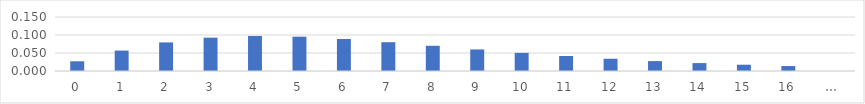
| Category | Series 0 |
|---|---|
| 0 | 0.027 |
| 1 | 0.057 |
| 2 | 0.079 |
| 3 | 0.093 |
| 4 | 0.097 |
| 5 | 0.095 |
| 6 | 0.089 |
| 7 | 0.08 |
| 8 | 0.07 |
| 9 | 0.06 |
| 10 | 0.05 |
| 11 | 0.042 |
| 12 | 0.034 |
| 13 | 0.027 |
| 14 | 0.022 |
| 15 | 0.017 |
| 16 | 0.014 |
| … | 0 |